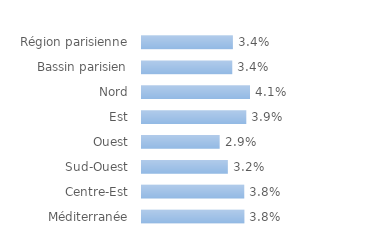
| Category | Series 0 |
|---|---|
| Région parisienne | 0.034 |
| Bassin parisien | 0.034 |
| Nord | 0.041 |
| Est | 0.039 |
| Ouest | 0.029 |
| Sud-Ouest | 0.032 |
| Centre-Est | 0.038 |
| Méditerranée | 0.038 |